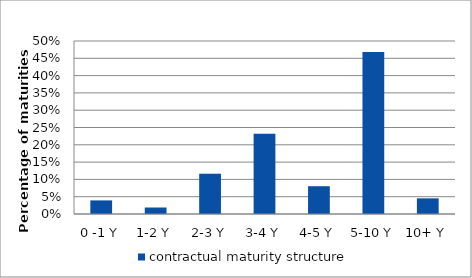
| Category | contractual maturity structure |
|---|---|
| 0 -1 Y | 0.039 |
| 1-2 Y | 0.019 |
| 2-3 Y | 0.116 |
| 3-4 Y | 0.232 |
| 4-5 Y | 0.08 |
| 5-10 Y | 0.468 |
| 10+ Y | 0.045 |